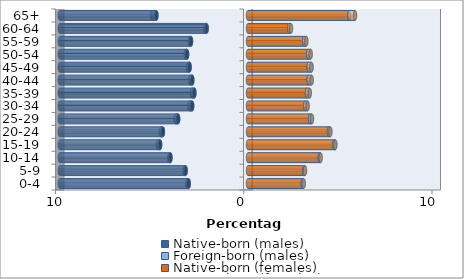
| Category | Native-born (males) | Foreign-born (males) | Native-born (females) | Foreign-born (females) |
|---|---|---|---|---|
| 0-4 | -3.151 | -0.07 | 2.909 | 0.052 |
| 5-9 | -3.314 | -0.056 | 2.98 | 0.05 |
| 10-14 | -4.12 | -0.062 | 3.814 | 0.045 |
| 15-19 | -4.669 | -0.12 | 4.583 | 0.059 |
| 20-24 | -4.521 | -0.112 | 4.302 | 0.074 |
| 25-29 | -3.713 | -0.132 | 3.3 | 0.102 |
| 30-34 | -2.966 | -0.141 | 3.04 | 0.129 |
| 35-39 | -2.85 | -0.129 | 3.13 | 0.149 |
| 40-44 | -2.958 | -0.105 | 3.227 | 0.158 |
| 45-49 | -3.103 | -0.08 | 3.224 | 0.151 |
| 50-54 | -3.236 | -0.065 | 3.195 | 0.137 |
| 55-59 | -3.027 | -0.063 | 2.984 | 0.117 |
| 60-64 | -2.198 | -0.069 | 2.186 | 0.099 |
| 65+ | -4.866 | -0.226 | 5.384 | 0.303 |